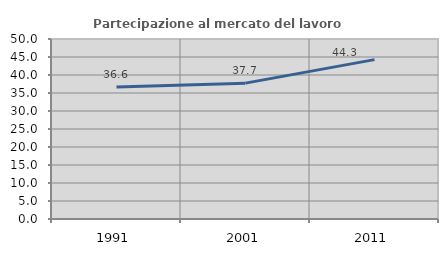
| Category | Partecipazione al mercato del lavoro  femminile |
|---|---|
| 1991.0 | 36.642 |
| 2001.0 | 37.741 |
| 2011.0 | 44.269 |